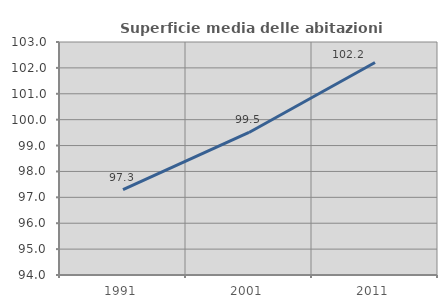
| Category | Superficie media delle abitazioni occupate |
|---|---|
| 1991.0 | 97.293 |
| 2001.0 | 99.506 |
| 2011.0 | 102.208 |